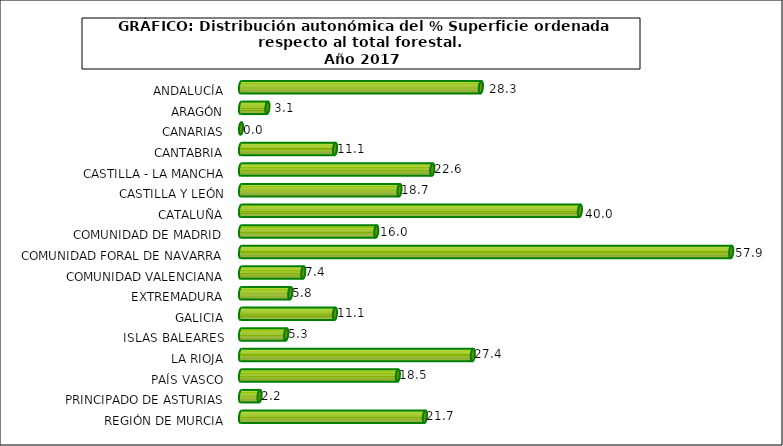
| Category | Series 1 |
|---|---|
| ANDALUCÍA | 28.346 |
| ARAGÓN | 3.119 |
| CANARIAS | 0 |
| CANTABRIA | 11.107 |
| CASTILLA - LA MANCHA | 22.602 |
| CASTILLA Y LEÓN | 18.726 |
| CATALUÑA | 40.049 |
| COMUNIDAD DE MADRID | 15.982 |
| COMUNIDAD FORAL DE NAVARRA | 57.926 |
| COMUNIDAD VALENCIANA | 7.358 |
| EXTREMADURA | 5.822 |
| GALICIA | 11.1 |
| ISLAS BALEARES | 5.336 |
| LA RIOJA | 27.393 |
| PAÍS VASCO | 18.535 |
| PRINCIPADO DE ASTURIAS | 2.193 |
| REGIÓN DE MURCIA | 21.726 |